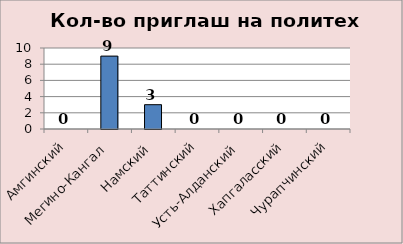
| Category | политехнич |
|---|---|
| Амгинский | 0 |
| Мегино-Кангал | 9 |
| Намский | 3 |
| Таттинский | 0 |
| Усть-Алданский | 0 |
| Хапгаласский | 0 |
| Чурапчинский | 0 |